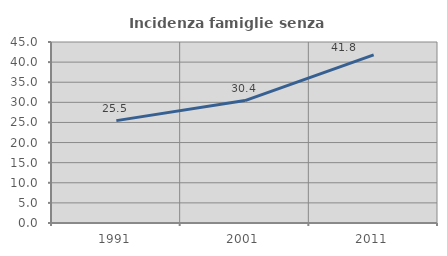
| Category | Incidenza famiglie senza nuclei |
|---|---|
| 1991.0 | 25.455 |
| 2001.0 | 30.443 |
| 2011.0 | 41.785 |